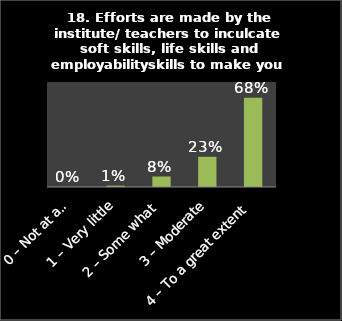
| Category | Series 0 |
|---|---|
| 0 – Not at all | 0 |
| 1 – Very little | 0.01 |
| 2 – Some what | 0.08 |
| 3 – Moderate | 0.23 |
| 4 – To a great extent | 0.68 |